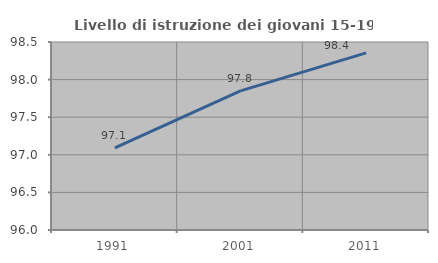
| Category | Livello di istruzione dei giovani 15-19 anni |
|---|---|
| 1991.0 | 97.093 |
| 2001.0 | 97.849 |
| 2011.0 | 98.355 |